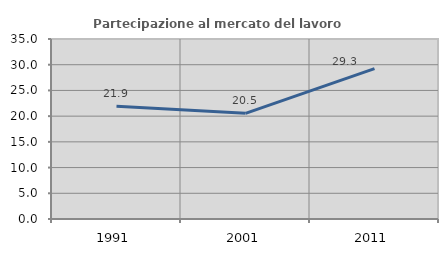
| Category | Partecipazione al mercato del lavoro  femminile |
|---|---|
| 1991.0 | 21.939 |
| 2001.0 | 20.541 |
| 2011.0 | 29.252 |